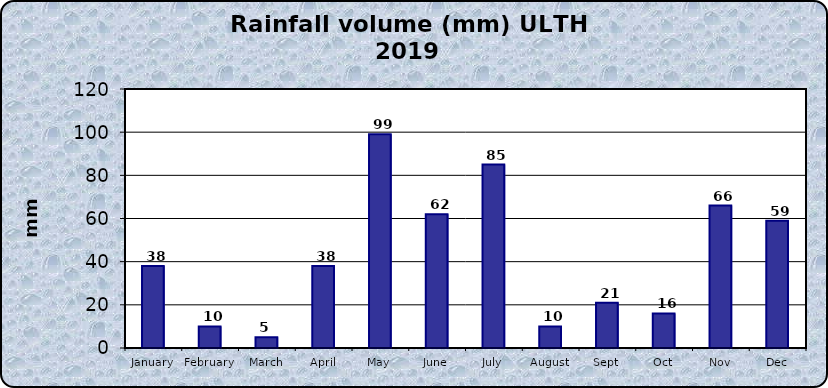
| Category | Series 0 |
|---|---|
| January | 38 |
| February | 10 |
| March | 5 |
| April | 38 |
| May | 99 |
| June | 62 |
| July | 85 |
| August | 10 |
| Sept | 21 |
| Oct | 16 |
| Nov | 66 |
| Dec | 59 |